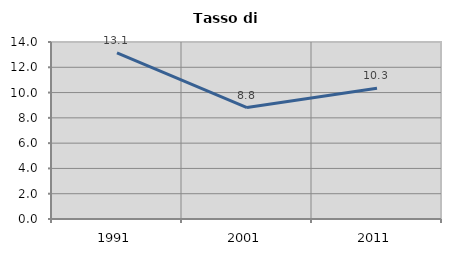
| Category | Tasso di disoccupazione   |
|---|---|
| 1991.0 | 13.147 |
| 2001.0 | 8.817 |
| 2011.0 | 10.341 |